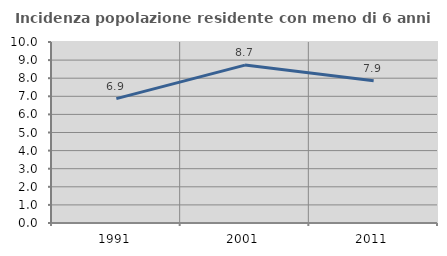
| Category | Incidenza popolazione residente con meno di 6 anni |
|---|---|
| 1991.0 | 6.87 |
| 2001.0 | 8.723 |
| 2011.0 | 7.857 |